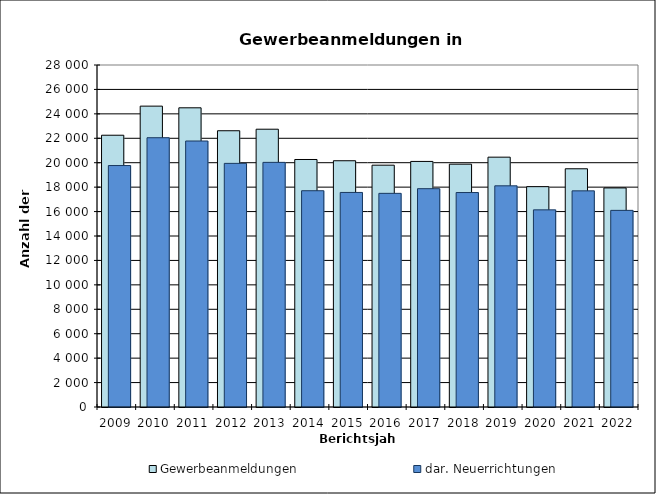
| Category | Gewerbeanmeldungen | dar. Neuerrichtungen |
|---|---|---|
| 2009.0 | 22250 | 19769 |
| 2010.0 | 24632 | 22046 |
| 2011.0 | 24495 | 21777 |
| 2012.0 | 22618 | 19945 |
| 2013.0 | 22743 | 20029 |
| 2014.0 | 20264 | 17706 |
| 2015.0 | 20162 | 17566 |
| 2016.0 | 19798 | 17492 |
| 2017.0 | 20105 | 17874 |
| 2018.0 | 19880 | 17558 |
| 2019.0 | 20454 | 18108 |
| 2020.0 | 18040 | 16141 |
| 2021.0 | 19504 | 17696 |
| 2022.0 | 17935 | 16098 |